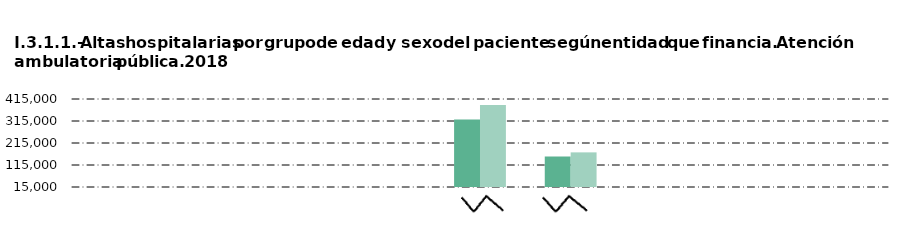
| Category |     Hombre |     Mujer |
|---|---|---|
| Andalucía | 222 | 301 |
| Castilla y León  | 736 | 660 |
| Castilla - La Mancha | 935 | 822 |
| Extremadura | 347 | 260 |
| Madrid (Comunidad de) | 321710 | 388285 |
| Resto de CC.AA. | 153651 | 172408 |
| Mutualidades y aseguradoras | 2352 | 2219 |
| Particulares | 184 | 222 |
| Otros | 93 | 129 |